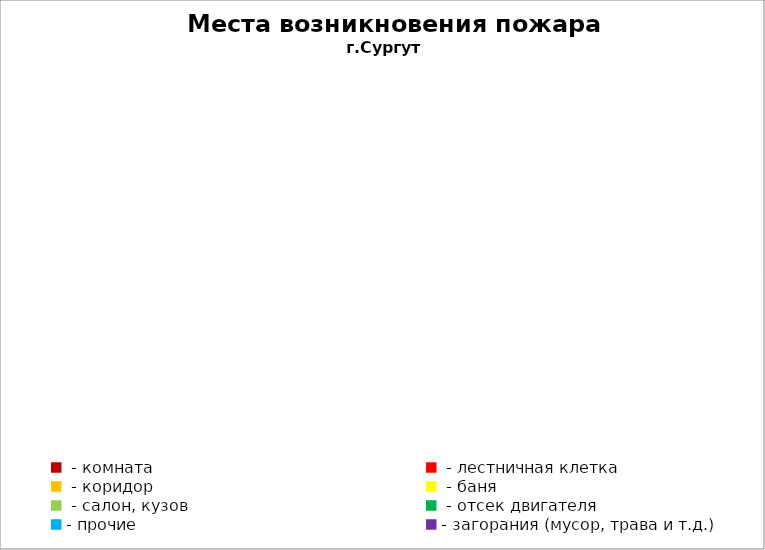
| Category | Места возникновения пожара |
|---|---|
|  - комната | 51 |
|  - лестничная клетка | 12 |
|  - коридор | 9 |
|  - баня | 29 |
|  - салон, кузов | 18 |
|  - отсек двигателя | 35 |
| - прочие | 70 |
| - загорания (мусор, трава и т.д.)  | 142 |